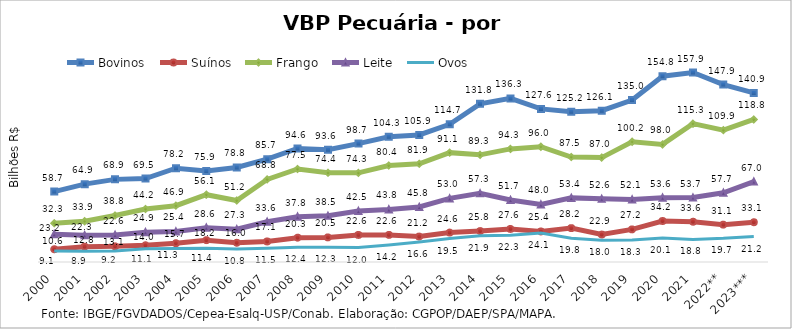
| Category | Bovinos | Suínos | Frango | Leite | Ovos |
|---|---|---|---|---|---|
| 2000 | 58.699 | 10.628 | 32.3 | 23.185 | 9.065 |
| 2001 | 64.886 | 12.751 | 33.949 | 22.311 | 8.933 |
| 2002 | 68.857 | 13.069 | 38.752 | 22.592 | 9.204 |
| 2003 | 69.494 | 13.967 | 44.18 | 24.878 | 11.133 |
| 2004 | 78.189 | 15.703 | 46.914 | 25.427 | 11.283 |
| 2005 | 75.911 | 18.207 | 56.088 | 28.598 | 11.36 |
| 2006 | 78.814 | 16.015 | 51.239 | 27.316 | 10.791 |
| 2007 | 85.652 | 17.126 | 68.845 | 33.581 | 11.468 |
| 2008 | 94.57 | 20.278 | 77.497 | 37.777 | 12.386 |
| 2009 | 93.584 | 20.498 | 74.408 | 38.514 | 12.35 |
| 2010 | 98.666 | 22.55 | 74.318 | 42.533 | 12.011 |
| 2011 | 104.305 | 22.586 | 80.379 | 43.846 | 14.153 |
| 2012 | 105.86 | 21.207 | 81.879 | 45.818 | 16.591 |
| 2013 | 114.715 | 24.554 | 91.132 | 53.02 | 19.513 |
| 2014 | 131.786 | 25.79 | 89.289 | 57.255 | 21.924 |
| 2015 | 136.322 | 27.561 | 94.261 | 51.682 | 22.323 |
| 2016 | 127.603 | 25.435 | 96.046 | 47.955 | 24.066 |
| 2017 | 125.221 | 28.235 | 87.481 | 53.432 | 19.837 |
| 2018 | 126.06 | 22.867 | 87.004 | 52.638 | 18.038 |
| 2019 | 134.982 | 27.18 | 100.176 | 52.15 | 18.268 |
| 2020 | 154.833 | 34.165 | 98.009 | 53.617 | 20.062 |
| 2021 | 157.889 | 33.556 | 115.297 | 53.677 | 18.8 |
| 2022** | 147.884 | 31.126 | 109.928 | 57.691 | 19.729 |
| 2023*** | 140.863 | 33.143 | 118.781 | 66.983 | 21.238 |